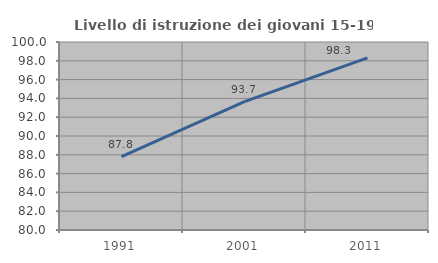
| Category | Livello di istruzione dei giovani 15-19 anni |
|---|---|
| 1991.0 | 87.793 |
| 2001.0 | 93.662 |
| 2011.0 | 98.305 |